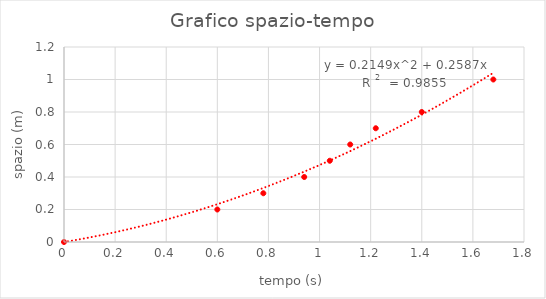
| Category | Series 0 |
|---|---|
| 0.0 | 0 |
| 0.6 | 0.2 |
| 0.7799999999999999 | 0.3 |
| 0.9399999999999998 | 0.4 |
| 1.04 | 0.5 |
| 1.1199999999999999 | 0.6 |
| 1.2200000000000002 | 0.7 |
| 1.4 | 0.8 |
| 1.6799999999999997 | 1 |